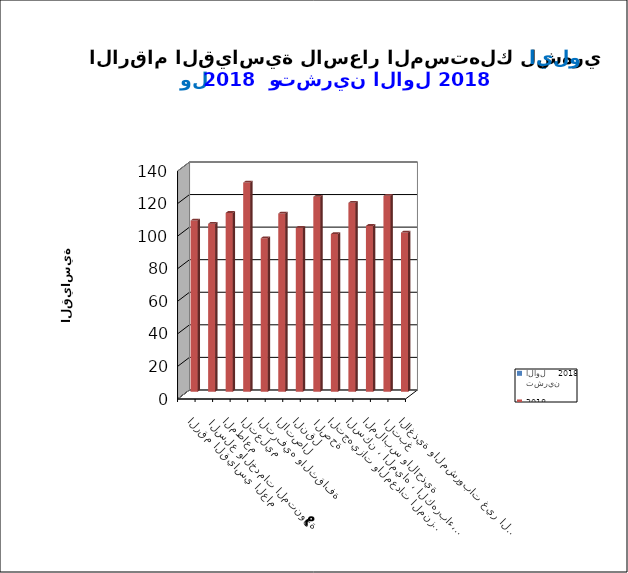
| Category | تشرين الاول    2018      |  ايلول    2018      |
|---|---|---|
| الاغذية والمشروبات غير الكحولية |  | 97.7 |
|  التبغ |  | 120.3 |
| الملابس والاحذية |  | 101.8 |
| السكن ، المياه ، الكهرباء، الغاز  |  | 116 |
| التجهيزات والمعدات المنزلية والصيانة |  | 96.8 |
|  الصحة |  | 119.7 |
| النقل |  | 100.7 |
| الاتصال |  | 109.4 |
| الترفيه والثقافة |  | 94.2 |
| التعليم |  | 128.4 |
| المطاعم  |  | 109.8 |
|  السلع والخدمات المتنوعة |  | 103.1 |
| الرقم القياسي العام |  | 105.1 |